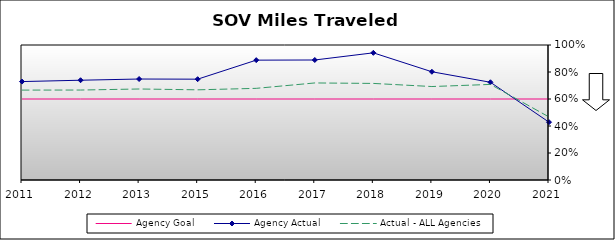
| Category | Agency Goal | Agency Actual | Actual - ALL Agencies |
|---|---|---|---|
| 2011.0 | 0.6 | 0.729 | 0.666 |
| 2012.0 | 0.6 | 0.739 | 0.666 |
| 2013.0 | 0.6 | 0.748 | 0.674 |
| 2015.0 | 0.6 | 0.747 | 0.668 |
| 2016.0 | 0.6 | 0.888 | 0.679 |
| 2017.0 | 0.6 | 0.889 | 0.719 |
| 2018.0 | 0.6 | 0.942 | 0.715 |
| 2019.0 | 0.6 | 0.802 | 0.692 |
| 2020.0 | 0.6 | 0.724 | 0.708 |
| 2021.0 | 0.6 | 0.428 | 0.467 |